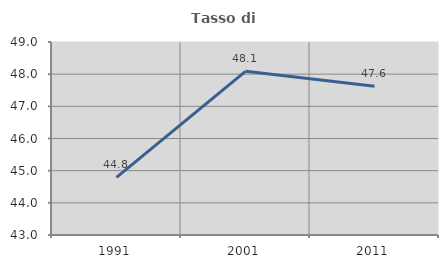
| Category | Tasso di occupazione   |
|---|---|
| 1991.0 | 44.794 |
| 2001.0 | 48.088 |
| 2011.0 | 47.625 |